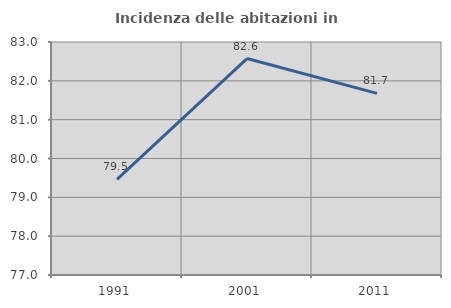
| Category | Incidenza delle abitazioni in proprietà  |
|---|---|
| 1991.0 | 79.461 |
| 2001.0 | 82.573 |
| 2011.0 | 81.678 |